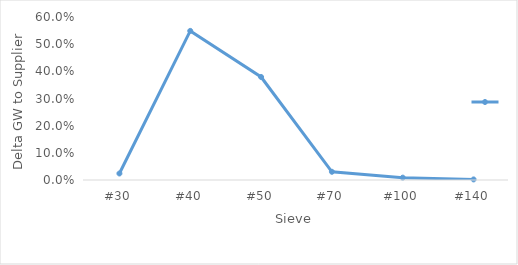
| Category | Series 0 |
|---|---|
| #30 | 0.024 |
| #40 | 0.549 |
| #50 | 0.379 |
| #70 | 0.03 |
| #100 | 0.009 |
| #140 | 0.002 |